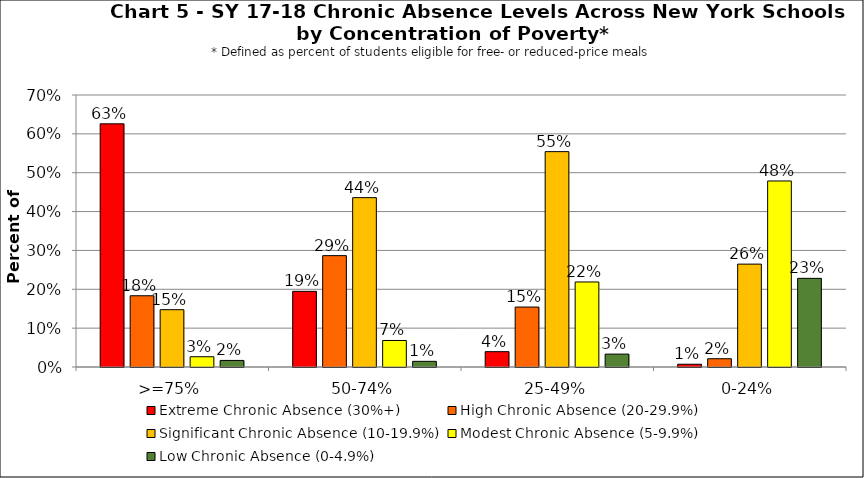
| Category | Extreme Chronic Absence (30%+) | High Chronic Absence (20-29.9%) | Significant Chronic Absence (10-19.9%) | Modest Chronic Absence (5-9.9%) | Low Chronic Absence (0-4.9%) |
|---|---|---|---|---|---|
| 0 | 0.626 | 0.183 | 0.147 | 0.026 | 0.017 |
| 1 | 0.195 | 0.287 | 0.436 | 0.068 | 0.015 |
| 2 | 0.039 | 0.154 | 0.554 | 0.219 | 0.033 |
| 3 | 0.007 | 0.021 | 0.265 | 0.479 | 0.228 |